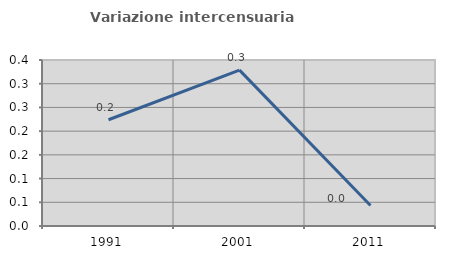
| Category | Variazione intercensuaria annua |
|---|---|
| 1991.0 | 0.224 |
| 2001.0 | 0.329 |
| 2011.0 | 0.043 |